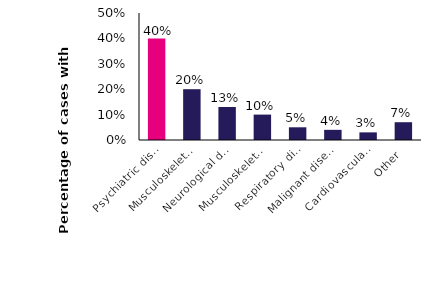
| Category | Series 0 |
|---|---|
| Psychiatric disorders | 0.4 |
| Musculoskeletal disease (general) | 0.2 |
| Neurological disease | 0.13 |
| Musculoskeletal disease (regional) | 0.1 |
| Respiratory disease | 0.05 |
| Malignant disease | 0.04 |
| Cardiovascular disease | 0.03 |
| Other | 0.07 |